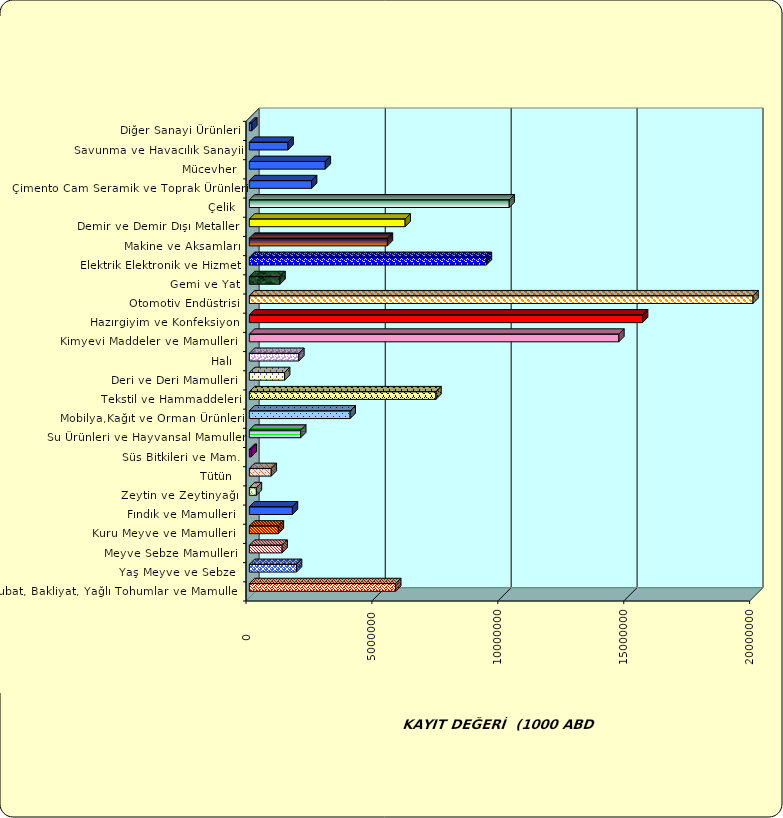
| Category | Series 0 |
|---|---|
|  Hububat, Bakliyat, Yağlı Tohumlar ve Mamulleri  | 5810290.225 |
|  Yaş Meyve ve Sebze   | 1872400.879 |
|  Meyve Sebze Mamulleri  | 1299268.836 |
|  Kuru Meyve ve Mamulleri   | 1150988.069 |
|  Fındık ve Mamulleri  | 1710749.257 |
|  Zeytin ve Zeytinyağı  | 279335.101 |
|  Tütün  | 869980.501 |
|  Süs Bitkileri ve Mam. | 74473.616 |
|  Su Ürünleri ve Hayvansal Mamuller | 2038896.675 |
|  Mobilya,Kağıt ve Orman Ürünleri | 4002845.396 |
|  Tekstil ve Hammaddeleri | 7409260.667 |
|  Deri ve Deri Mamulleri  | 1400462.52 |
|  Halı  | 1965079.655 |
|  Kimyevi Maddeler ve Mamulleri   | 14672486.414 |
|  Hazırgiyim ve Konfeksiyon  | 15611866.839 |
|  Otomotiv Endüstrisi | 26045475.113 |
|  Gemi ve Yat | 1217203.499 |
|  Elektrik Elektronik ve Hizmet | 9411576.878 |
|  Makine ve Aksamları | 5481373.285 |
|  Demir ve Demir Dışı Metaller  | 6186733.875 |
|  Çelik | 10319460.007 |
|  Çimento Cam Seramik ve Toprak Ürünleri | 2470846.899 |
|  Mücevher | 3016162.473 |
|  Savunma ve Havacılık Sanayii | 1536237.586 |
|  Diğer Sanayi Ürünleri | 97392.552 |